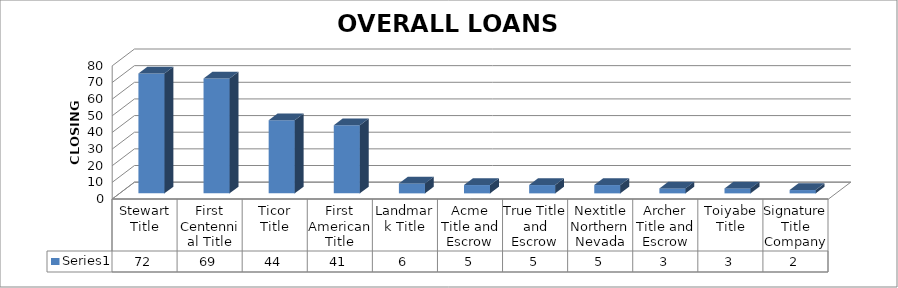
| Category | Series 0 |
|---|---|
| Stewart Title | 72 |
| First Centennial Title | 69 |
| Ticor Title | 44 |
| First American Title | 41 |
| Landmark Title | 6 |
| Acme Title and Escrow | 5 |
| True Title and Escrow | 5 |
| Nextitle Northern Nevada | 5 |
| Archer Title and Escrow | 3 |
| Toiyabe Title | 3 |
| Signature Title Company | 2 |